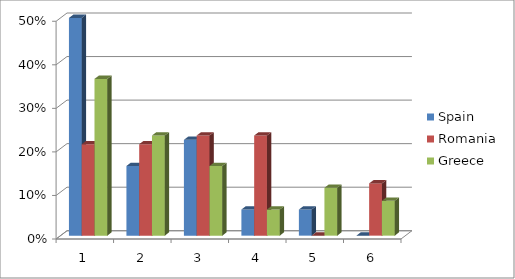
| Category | Spain | Romania | Greece |
|---|---|---|---|
| 0 | 0.5 | 0.21 | 0.36 |
| 1 | 0.16 | 0.21 | 0.23 |
| 2 | 0.22 | 0.23 | 0.16 |
| 3 | 0.06 | 0.23 | 0.06 |
| 4 | 0.06 | 0 | 0.11 |
| 5 | 0 | 0.12 | 0.08 |